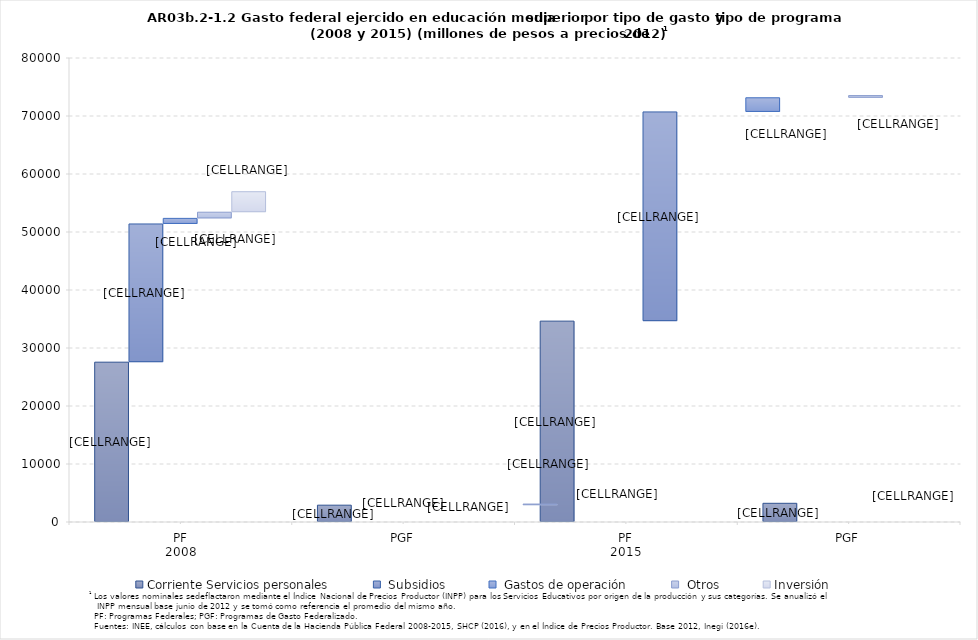
| Category | Corriente Servicios personales | Corriente Subsidios | Corriente Gastos de operación | Corriente Otros | Inversión |
|---|---|---|---|---|---|
| 0 | 27554.17 | 23831.37 | 961.77 | 1063.58 | 3536.79 |
| 1 | 2901.05 | 0 | 0 | 191.7 | 0 |
| 2 | 34632.95 | 36069.47 | 2438.74 | 379.31 | 2500.23 |
| 3 | 3222.31 | 0 | 0 | 162.96 | 415.75 |